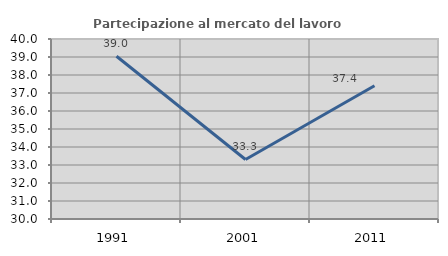
| Category | Partecipazione al mercato del lavoro  femminile |
|---|---|
| 1991.0 | 39.043 |
| 2001.0 | 33.306 |
| 2011.0 | 37.4 |